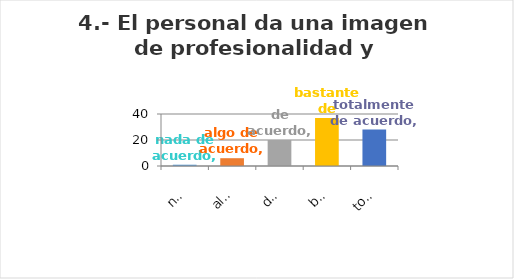
| Category | Series 0 |
|---|---|
| nada de acuerdo | 1 |
| algo de acuerdo | 6 |
| de acuerdo | 20 |
| bastante de acuerdo | 37 |
| totalmente de acuerdo | 28 |